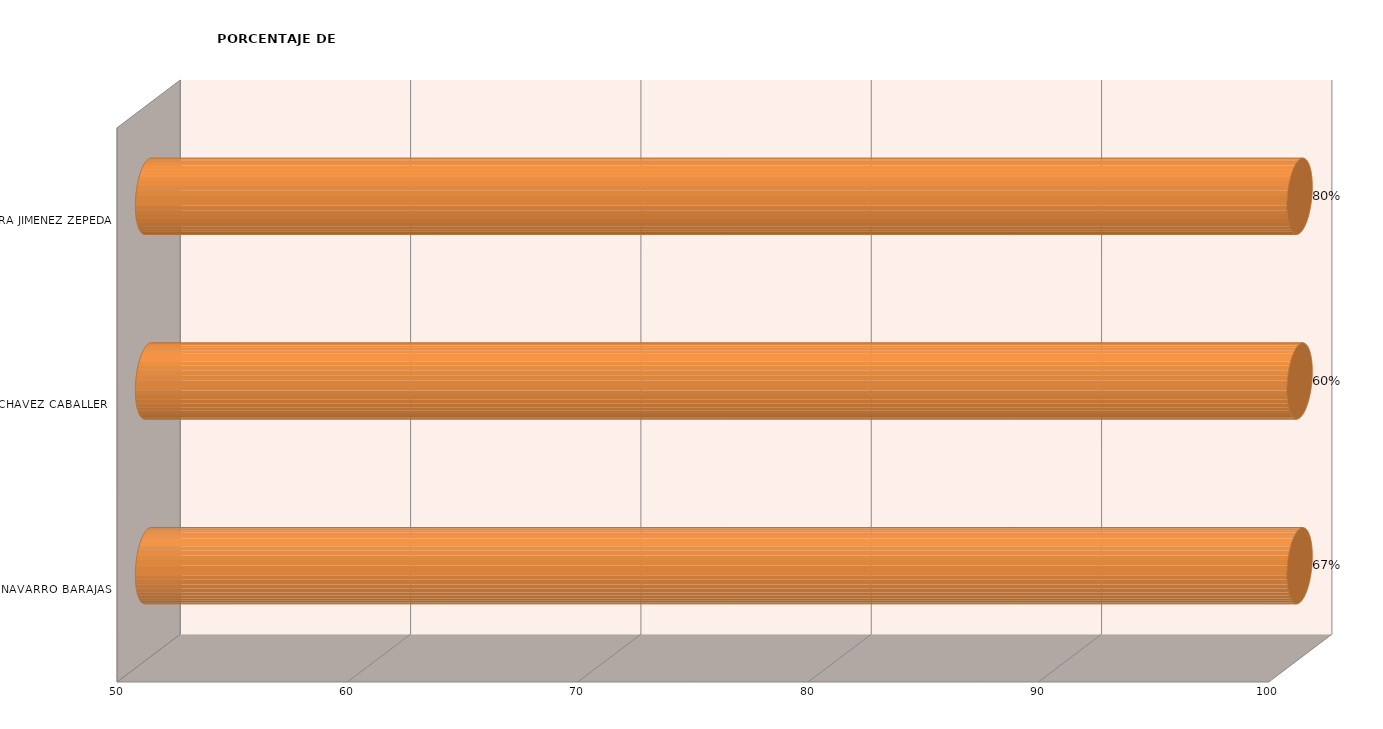
| Category | Series 0 |
|---|---|
| ANDREA NAVARRO BARAJAS  | 100 |
| JUAN PABLO CHAVEZ CABALLERO | 100 |
| ALEJANDRA JIMENEZ ZEPEDA | 100 |